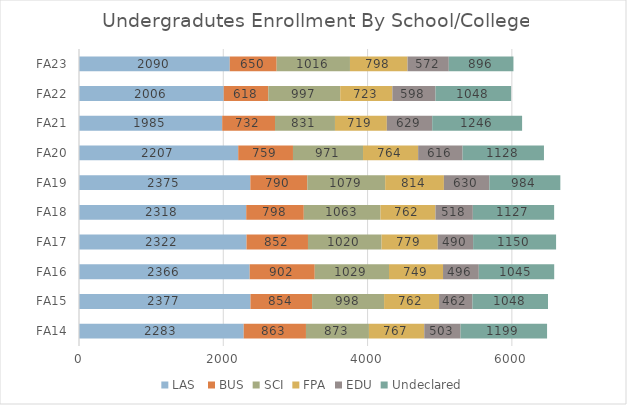
| Category | LAS  | BUS | SCI | FPA | EDU | Undeclared |
|---|---|---|---|---|---|---|
| FA14 | 2283 | 863 | 873 | 767 | 503 | 1199 |
| FA15 | 2377 | 854 | 998 | 762 | 462 | 1048 |
| FA16 | 2366 | 902 | 1029 | 749 | 496 | 1045 |
| FA17 | 2322 | 852 | 1020 | 779 | 490 | 1150 |
| FA18 | 2318 | 798 | 1063 | 762 | 518 | 1127 |
| FA19 | 2375 | 790 | 1079 | 814 | 630 | 984 |
| FA20 | 2207 | 759 | 971 | 764 | 616 | 1128 |
| FA21 | 1985 | 732 | 831 | 719 | 629 | 1246 |
| FA22 | 2006 | 618 | 997 | 723 | 598 | 1048 |
| FA23 | 2090 | 650 | 1016 | 798 | 572 | 896 |